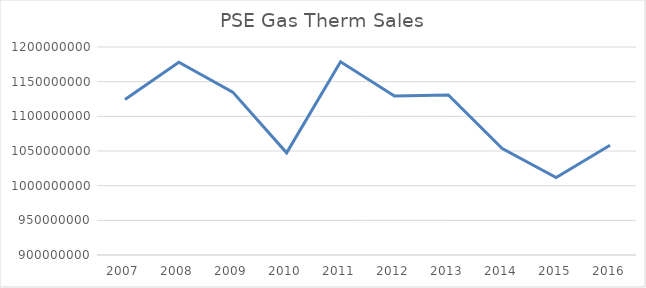
| Category | Series 0 |
|---|---|
| 2007.0 | 1124291607 |
| 2008.0 | 1178093827.998 |
| 2009.0 | 1134947308.623 |
| 2010.0 | 1047318633 |
| 2011.0 | 1178609457 |
| 2012.0 | 1129344068 |
| 2013.0 | 1130929672.806 |
| 2014.0 | 1053540975.27 |
| 2015.0 | 1011603982.387 |
| 2016.0 | 1058397439.283 |